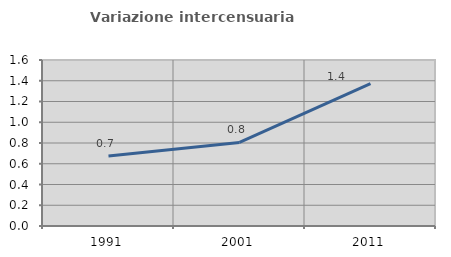
| Category | Variazione intercensuaria annua |
|---|---|
| 1991.0 | 0.674 |
| 2001.0 | 0.806 |
| 2011.0 | 1.372 |